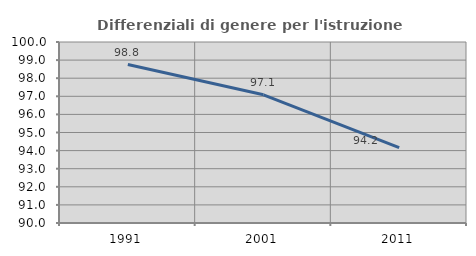
| Category | Differenziali di genere per l'istruzione superiore |
|---|---|
| 1991.0 | 98.753 |
| 2001.0 | 97.084 |
| 2011.0 | 94.161 |